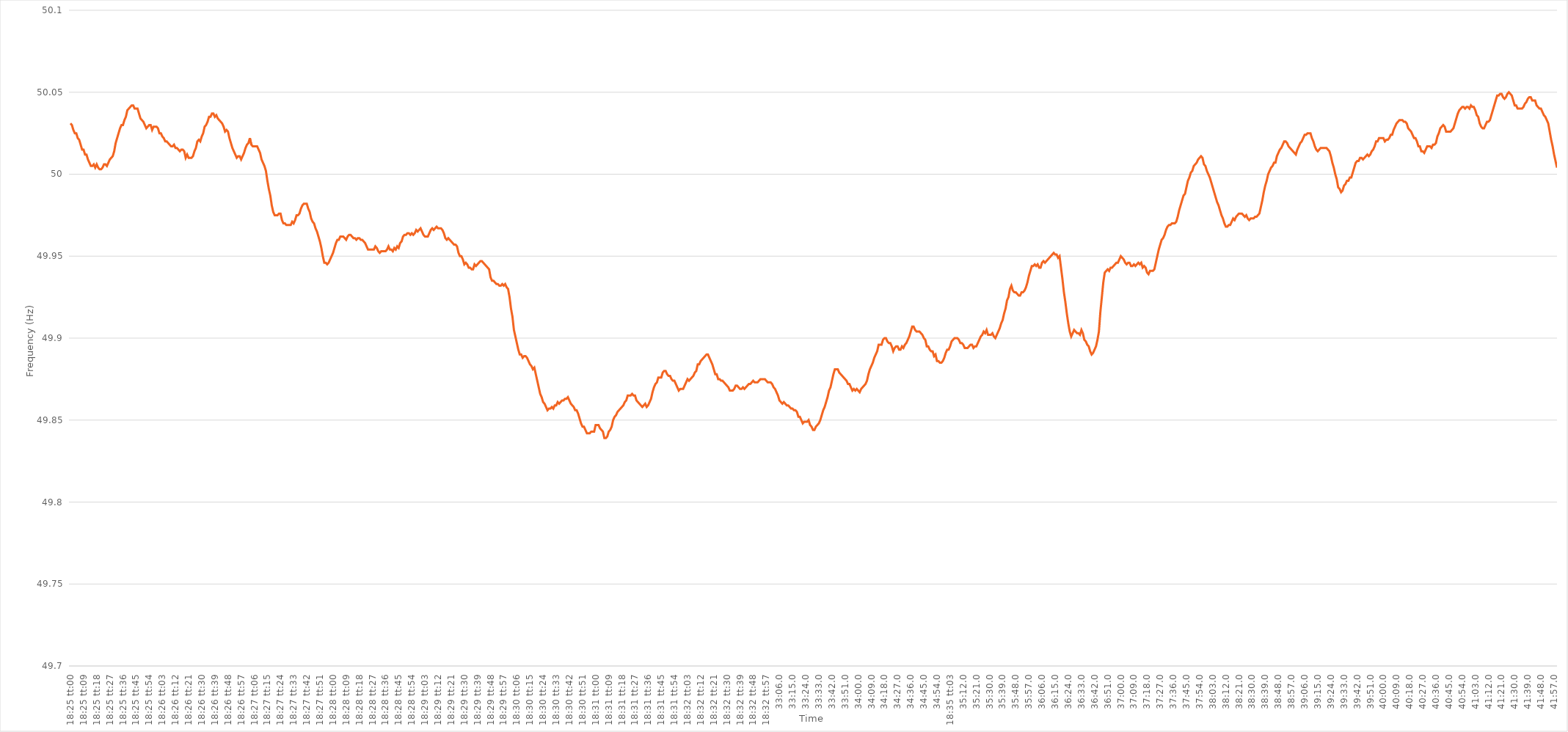
| Category | Series 0 |
|---|---|
| 0.7673611111111112 | 50.031 |
| 0.7673726851851851 | 50.03 |
| 0.7673842592592592 | 50.027 |
| 0.7673958333333334 | 50.025 |
| 0.7674074074074074 | 50.025 |
| 0.7674189814814815 | 50.022 |
| 0.7674305555555555 | 50.021 |
| 0.7674421296296297 | 50.018 |
| 0.7674537037037038 | 50.015 |
| 0.7674652777777777 | 50.015 |
| 0.7674768518518519 | 50.012 |
| 0.7674884259259259 | 50.012 |
| 0.7675000000000001 | 50.009 |
| 0.767511574074074 | 50.007 |
| 0.7675231481481481 | 50.005 |
| 0.7675347222222223 | 50.005 |
| 0.7675462962962962 | 50.006 |
| 0.7675578703703704 | 50.004 |
| 0.7675694444444444 | 50.006 |
| 0.7675810185185186 | 50.004 |
| 0.7675925925925925 | 50.003 |
| 0.7676041666666666 | 50.003 |
| 0.7676157407407408 | 50.004 |
| 0.7676273148148148 | 50.006 |
| 0.7676388888888889 | 50.006 |
| 0.7676504629629629 | 50.005 |
| 0.7676620370370371 | 50.007 |
| 0.7676736111111112 | 50.009 |
| 0.7676851851851851 | 50.01 |
| 0.7676967592592593 | 50.011 |
| 0.7677083333333333 | 50.014 |
| 0.7677199074074075 | 50.019 |
| 0.7677314814814814 | 50.022 |
| 0.7677430555555556 | 50.025 |
| 0.7677546296296297 | 50.028 |
| 0.7677662037037036 | 50.03 |
| 0.7677777777777778 | 50.03 |
| 0.7677893518518518 | 50.033 |
| 0.767800925925926 | 50.035 |
| 0.7678124999999999 | 50.039 |
| 0.767824074074074 | 50.04 |
| 0.7678356481481482 | 50.041 |
| 0.7678472222222222 | 50.042 |
| 0.7678587962962963 | 50.042 |
| 0.7678703703703703 | 50.04 |
| 0.7678819444444445 | 50.04 |
| 0.7678935185185186 | 50.04 |
| 0.7679050925925925 | 50.037 |
| 0.7679166666666667 | 50.034 |
| 0.7679282407407407 | 50.033 |
| 0.7679398148148149 | 50.032 |
| 0.7679513888888888 | 50.03 |
| 0.767962962962963 | 50.028 |
| 0.7679745370370371 | 50.029 |
| 0.767986111111111 | 50.03 |
| 0.7679976851851852 | 50.03 |
| 0.7680092592592592 | 50.027 |
| 0.7680208333333334 | 50.029 |
| 0.7680324074074073 | 50.029 |
| 0.7680439814814815 | 50.029 |
| 0.7680555555555556 | 50.028 |
| 0.7680671296296296 | 50.025 |
| 0.7680787037037037 | 50.025 |
| 0.7680902777777777 | 50.023 |
| 0.7681018518518519 | 50.022 |
| 0.768113425925926 | 50.02 |
| 0.768125 | 50.02 |
| 0.7681365740740741 | 50.019 |
| 0.7681481481481481 | 50.018 |
| 0.7681597222222223 | 50.017 |
| 0.7681712962962962 | 50.017 |
| 0.7681828703703704 | 50.018 |
| 0.7681944444444445 | 50.016 |
| 0.7682060185185186 | 50.016 |
| 0.7682175925925926 | 50.015 |
| 0.7682291666666666 | 50.014 |
| 0.7682407407407408 | 50.015 |
| 0.7682523148148147 | 50.015 |
| 0.7682638888888889 | 50.014 |
| 0.768275462962963 | 50.01 |
| 0.768287037037037 | 50.012 |
| 0.7682986111111111 | 50.01 |
| 0.7683101851851851 | 50.01 |
| 0.7683217592592593 | 50.01 |
| 0.7683333333333334 | 50.011 |
| 0.7683449074074074 | 50.014 |
| 0.7683564814814815 | 50.016 |
| 0.7683680555555555 | 50.02 |
| 0.7683796296296297 | 50.021 |
| 0.7683912037037036 | 50.02 |
| 0.7684027777777778 | 50.023 |
| 0.7684143518518519 | 50.025 |
| 0.768425925925926 | 50.029 |
| 0.7684375 | 50.03 |
| 0.768449074074074 | 50.032 |
| 0.7684606481481482 | 50.035 |
| 0.7684722222222223 | 50.035 |
| 0.7684837962962963 | 50.037 |
| 0.7684953703703704 | 50.037 |
| 0.7685069444444445 | 50.035 |
| 0.7685185185185185 | 50.036 |
| 0.7685300925925925 | 50.034 |
| 0.7685416666666667 | 50.033 |
| 0.7685532407407408 | 50.032 |
| 0.7685648148148148 | 50.031 |
| 0.7685763888888889 | 50.029 |
| 0.768587962962963 | 50.026 |
| 0.7685995370370371 | 50.027 |
| 0.768611111111111 | 50.026 |
| 0.7686226851851852 | 50.022 |
| 0.7686342592592593 | 50.019 |
| 0.7686458333333334 | 50.016 |
| 0.7686574074074074 | 50.014 |
| 0.7686689814814814 | 50.012 |
| 0.7686805555555556 | 50.01 |
| 0.7686921296296297 | 50.011 |
| 0.7687037037037037 | 50.011 |
| 0.7687152777777778 | 50.009 |
| 0.7687268518518519 | 50.011 |
| 0.7687384259259259 | 50.013 |
| 0.7687499999999999 | 50.016 |
| 0.7687615740740741 | 50.018 |
| 0.7687731481481482 | 50.019 |
| 0.7687847222222222 | 50.022 |
| 0.7687962962962963 | 50.018 |
| 0.7688078703703703 | 50.017 |
| 0.7688194444444445 | 50.017 |
| 0.7688310185185184 | 50.017 |
| 0.7688425925925926 | 50.017 |
| 0.7688541666666667 | 50.015 |
| 0.7688657407407408 | 50.013 |
| 0.7688773148148148 | 50.009 |
| 0.7688888888888888 | 50.007 |
| 0.768900462962963 | 50.005 |
| 0.7689120370370371 | 50.002 |
| 0.7689236111111111 | 49.996 |
| 0.7689351851851852 | 49.991 |
| 0.7689467592592593 | 49.987 |
| 0.7689583333333333 | 49.981 |
| 0.7689699074074073 | 49.977 |
| 0.7689814814814815 | 49.975 |
| 0.7689930555555556 | 49.975 |
| 0.7690046296296296 | 49.975 |
| 0.7690162037037037 | 49.976 |
| 0.7690277777777778 | 49.976 |
| 0.7690393518518519 | 49.972 |
| 0.7690509259259258 | 49.97 |
| 0.7690625 | 49.97 |
| 0.7690740740740741 | 49.969 |
| 0.7690856481481482 | 49.969 |
| 0.7690972222222222 | 49.969 |
| 0.7691087962962962 | 49.969 |
| 0.7691203703703704 | 49.971 |
| 0.7691319444444445 | 49.97 |
| 0.7691435185185185 | 49.972 |
| 0.7691550925925926 | 49.975 |
| 0.7691666666666667 | 49.975 |
| 0.7691782407407407 | 49.976 |
| 0.7691898148148147 | 49.979 |
| 0.7692013888888889 | 49.981 |
| 0.769212962962963 | 49.982 |
| 0.769224537037037 | 49.982 |
| 0.7692361111111111 | 49.982 |
| 0.7692476851851852 | 49.979 |
| 0.7692592592592593 | 49.977 |
| 0.7692708333333332 | 49.973 |
| 0.7692824074074074 | 49.971 |
| 0.7692939814814815 | 49.97 |
| 0.7693055555555556 | 49.967 |
| 0.7693171296296296 | 49.965 |
| 0.7693287037037037 | 49.962 |
| 0.7693402777777778 | 49.959 |
| 0.769351851851852 | 49.955 |
| 0.7693634259259259 | 49.95 |
| 0.769375 | 49.946 |
| 0.7693865740740741 | 49.946 |
| 0.7693981481481482 | 49.945 |
| 0.7694097222222221 | 49.946 |
| 0.7694212962962963 | 49.948 |
| 0.7694328703703704 | 49.95 |
| 0.7694444444444444 | 49.952 |
| 0.7694560185185185 | 49.955 |
| 0.7694675925925926 | 49.958 |
| 0.7694791666666667 | 49.96 |
| 0.7694907407407406 | 49.96 |
| 0.7695023148148148 | 49.962 |
| 0.7695138888888889 | 49.962 |
| 0.769525462962963 | 49.962 |
| 0.769537037037037 | 49.961 |
| 0.7695486111111111 | 49.96 |
| 0.7695601851851852 | 49.962 |
| 0.7695717592592594 | 49.963 |
| 0.7695833333333333 | 49.963 |
| 0.7695949074074074 | 49.962 |
| 0.7696064814814815 | 49.961 |
| 0.7696180555555556 | 49.961 |
| 0.7696296296296296 | 49.96 |
| 0.7696412037037037 | 49.961 |
| 0.7696527777777779 | 49.961 |
| 0.7696643518518518 | 49.96 |
| 0.7696759259259259 | 49.96 |
| 0.7696875 | 49.959 |
| 0.7696990740740741 | 49.958 |
| 0.769710648148148 | 49.956 |
| 0.7697222222222222 | 49.954 |
| 0.7697337962962963 | 49.954 |
| 0.7697453703703704 | 49.954 |
| 0.7697569444444444 | 49.954 |
| 0.7697685185185185 | 49.954 |
| 0.7697800925925926 | 49.956 |
| 0.7697916666666668 | 49.955 |
| 0.7698032407407407 | 49.953 |
| 0.7698148148148148 | 49.952 |
| 0.7698263888888889 | 49.953 |
| 0.769837962962963 | 49.953 |
| 0.769849537037037 | 49.953 |
| 0.7698611111111111 | 49.953 |
| 0.7698726851851853 | 49.954 |
| 0.7698842592592593 | 49.956 |
| 0.7698958333333333 | 49.954 |
| 0.7699074074074074 | 49.954 |
| 0.7699189814814815 | 49.953 |
| 0.7699305555555555 | 49.955 |
| 0.7699421296296296 | 49.954 |
| 0.7699537037037038 | 49.956 |
| 0.7699652777777778 | 49.955 |
| 0.7699768518518518 | 49.958 |
| 0.7699884259259259 | 49.959 |
| 0.77 | 49.962 |
| 0.7700115740740742 | 49.963 |
| 0.7700231481481481 | 49.963 |
| 0.7700347222222222 | 49.964 |
| 0.7700462962962963 | 49.964 |
| 0.7700578703703704 | 49.963 |
| 0.7700694444444444 | 49.964 |
| 0.7700810185185185 | 49.963 |
| 0.7700925925925927 | 49.964 |
| 0.7701041666666667 | 49.966 |
| 0.7701157407407407 | 49.965 |
| 0.7701273148148148 | 49.966 |
| 0.7701388888888889 | 49.967 |
| 0.7701504629629629 | 49.965 |
| 0.770162037037037 | 49.963 |
| 0.7701736111111112 | 49.962 |
| 0.7701851851851852 | 49.962 |
| 0.7701967592592592 | 49.962 |
| 0.7702083333333333 | 49.964 |
| 0.7702199074074074 | 49.966 |
| 0.7702314814814816 | 49.967 |
| 0.7702430555555555 | 49.966 |
| 0.7702546296296297 | 49.967 |
| 0.7702662037037037 | 49.968 |
| 0.7702777777777778 | 49.967 |
| 0.7702893518518518 | 49.967 |
| 0.7703009259259259 | 49.967 |
| 0.7703125000000001 | 49.966 |
| 0.7703240740740741 | 49.964 |
| 0.7703356481481481 | 49.961 |
| 0.7703472222222222 | 49.96 |
| 0.7703587962962963 | 49.961 |
| 0.7703703703703703 | 49.96 |
| 0.7703819444444444 | 49.959 |
| 0.7703935185185186 | 49.958 |
| 0.7704050925925926 | 49.957 |
| 0.7704166666666666 | 49.957 |
| 0.7704282407407407 | 49.956 |
| 0.7704398148148148 | 49.952 |
| 0.770451388888889 | 49.95 |
| 0.7704629629629629 | 49.95 |
| 0.770474537037037 | 49.948 |
| 0.7704861111111111 | 49.945 |
| 0.7704976851851852 | 49.946 |
| 0.7705092592592592 | 49.945 |
| 0.7705208333333333 | 49.943 |
| 0.7705324074074075 | 49.943 |
| 0.7705439814814815 | 49.942 |
| 0.7705555555555555 | 49.942 |
| 0.7705671296296296 | 49.945 |
| 0.7705787037037037 | 49.944 |
| 0.7705902777777777 | 49.945 |
| 0.7706018518518518 | 49.946 |
| 0.770613425925926 | 49.947 |
| 0.770625 | 49.947 |
| 0.770636574074074 | 49.946 |
| 0.7706481481481481 | 49.945 |
| 0.7706597222222222 | 49.944 |
| 0.7706712962962964 | 49.943 |
| 0.7706828703703703 | 49.942 |
| 0.7706944444444445 | 49.937 |
| 0.7707060185185185 | 49.935 |
| 0.7707175925925926 | 49.935 |
| 0.7707291666666666 | 49.934 |
| 0.7707407407407407 | 49.933 |
| 0.7707523148148149 | 49.933 |
| 0.7707638888888889 | 49.932 |
| 0.770775462962963 | 49.932 |
| 0.770787037037037 | 49.933 |
| 0.7707986111111111 | 49.932 |
| 0.7708101851851853 | 49.933 |
| 0.7708217592592592 | 49.931 |
| 0.7708333333333334 | 49.93 |
| 0.7708449074074074 | 49.925 |
| 0.7708564814814814 | 49.918 |
| 0.7708680555555555 | 49.913 |
| 0.7708796296296296 | 49.905 |
| 0.7708912037037038 | 49.901 |
| 0.7709027777777777 | 49.897 |
| 0.7709143518518519 | 49.893 |
| 0.7709259259259259 | 49.89 |
| 0.7709375 | 49.89 |
| 0.770949074074074 | 49.888 |
| 0.7709606481481481 | 49.889 |
| 0.7709722222222223 | 49.889 |
| 0.7709837962962963 | 49.888 |
| 0.7709953703703704 | 49.886 |
| 0.7710069444444444 | 49.884 |
| 0.7710185185185185 | 49.883 |
| 0.7710300925925927 | 49.881 |
| 0.7710416666666666 | 49.882 |
| 0.7710532407407408 | 49.878 |
| 0.7710648148148148 | 49.874 |
| 0.771076388888889 | 49.87 |
| 0.7710879629629629 | 49.866 |
| 0.771099537037037 | 49.864 |
| 0.7711111111111112 | 49.861 |
| 0.7711226851851851 | 49.86 |
| 0.7711342592592593 | 49.858 |
| 0.7711458333333333 | 49.856 |
| 0.7711574074074075 | 49.857 |
| 0.7711689814814814 | 49.857 |
| 0.7711805555555555 | 49.858 |
| 0.7711921296296297 | 49.857 |
| 0.7712037037037037 | 49.859 |
| 0.7712152777777778 | 49.859 |
| 0.7712268518518518 | 49.861 |
| 0.771238425925926 | 49.86 |
| 0.7712500000000001 | 49.861 |
| 0.771261574074074 | 49.862 |
| 0.7712731481481482 | 49.862 |
| 0.7712847222222222 | 49.863 |
| 0.7712962962962964 | 49.863 |
| 0.7713078703703703 | 49.864 |
| 0.7713194444444444 | 49.862 |
| 0.7713310185185186 | 49.86 |
| 0.7713425925925925 | 49.859 |
| 0.7713541666666667 | 49.858 |
| 0.7713657407407407 | 49.856 |
| 0.7713773148148149 | 49.856 |
| 0.7713888888888888 | 49.854 |
| 0.7714004629629629 | 49.851 |
| 0.7714120370370371 | 49.848 |
| 0.7714236111111111 | 49.846 |
| 0.7714351851851852 | 49.846 |
| 0.7714467592592592 | 49.844 |
| 0.7714583333333334 | 49.842 |
| 0.7714699074074075 | 49.842 |
| 0.7714814814814814 | 49.842 |
| 0.7714930555555556 | 49.843 |
| 0.7715046296296296 | 49.843 |
| 0.7715162037037038 | 49.843 |
| 0.7715277777777777 | 49.847 |
| 0.7715393518518519 | 49.847 |
| 0.771550925925926 | 49.847 |
| 0.7715624999999999 | 49.845 |
| 0.7715740740740741 | 49.844 |
| 0.7715856481481481 | 49.843 |
| 0.7715972222222223 | 49.839 |
| 0.7716087962962962 | 49.839 |
| 0.7716203703703703 | 49.84 |
| 0.7716319444444445 | 49.843 |
| 0.7716435185185185 | 49.844 |
| 0.7716550925925926 | 49.846 |
| 0.7716666666666666 | 49.85 |
| 0.7716782407407408 | 49.852 |
| 0.7716898148148149 | 49.853 |
| 0.7717013888888888 | 49.855 |
| 0.771712962962963 | 49.856 |
| 0.771724537037037 | 49.857 |
| 0.7717361111111112 | 49.858 |
| 0.7717476851851851 | 49.859 |
| 0.7717592592592593 | 49.861 |
| 0.7717708333333334 | 49.862 |
| 0.7717824074074073 | 49.865 |
| 0.7717939814814815 | 49.865 |
| 0.7718055555555555 | 49.865 |
| 0.7718171296296297 | 49.866 |
| 0.7718287037037036 | 49.865 |
| 0.7718402777777778 | 49.865 |
| 0.7718518518518519 | 49.862 |
| 0.7718634259259259 | 49.861 |
| 0.771875 | 49.86 |
| 0.771886574074074 | 49.859 |
| 0.7718981481481482 | 49.858 |
| 0.7719097222222223 | 49.859 |
| 0.7719212962962962 | 49.86 |
| 0.7719328703703704 | 49.858 |
| 0.7719444444444444 | 49.859 |
| 0.7719560185185186 | 49.861 |
| 0.7719675925925925 | 49.863 |
| 0.7719791666666667 | 49.867 |
| 0.7719907407407408 | 49.87 |
| 0.7720023148148148 | 49.872 |
| 0.7720138888888889 | 49.873 |
| 0.7720254629629629 | 49.876 |
| 0.7720370370370371 | 49.876 |
| 0.772048611111111 | 49.876 |
| 0.7720601851851852 | 49.879 |
| 0.7720717592592593 | 49.88 |
| 0.7720833333333333 | 49.88 |
| 0.7720949074074074 | 49.878 |
| 0.7721064814814814 | 49.877 |
| 0.7721180555555556 | 49.877 |
| 0.7721296296296297 | 49.875 |
| 0.7721412037037036 | 49.874 |
| 0.7721527777777778 | 49.874 |
| 0.7721643518518518 | 49.872 |
| 0.772175925925926 | 49.87 |
| 0.7721874999999999 | 49.868 |
| 0.7721990740740741 | 49.869 |
| 0.7722106481481482 | 49.869 |
| 0.7722222222222223 | 49.869 |
| 0.7722337962962963 | 49.871 |
| 0.7722453703703703 | 49.873 |
| 0.7722569444444445 | 49.875 |
| 0.7722685185185186 | 49.874 |
| 0.7722800925925926 | 49.875 |
| 0.7722916666666667 | 49.876 |
| 0.7723032407407407 | 49.877 |
| 0.7723148148148148 | 49.879 |
| 0.7723263888888888 | 49.88 |
| 0.772337962962963 | 49.884 |
| 0.7723495370370371 | 49.884 |
| 0.772361111111111 | 49.886 |
| 0.7723726851851852 | 49.887 |
| 0.7723842592592592 | 49.888 |
| 0.7723958333333334 | 49.889 |
| 0.7724074074074073 | 49.89 |
| 0.7724189814814815 | 49.89 |
| 0.7724305555555556 | 49.888 |
| 0.7724421296296297 | 49.886 |
| 0.7724537037037037 | 49.884 |
| 0.7724652777777777 | 49.881 |
| 0.7724768518518519 | 49.878 |
| 0.772488425925926 | 49.878 |
| 0.7725 | 49.875 |
| 0.7725115740740741 | 49.875 |
| 0.7725231481481482 | 49.874 |
| 0.7725347222222222 | 49.874 |
| 0.7725462962962962 | 49.873 |
| 0.7725578703703704 | 49.872 |
| 0.7725694444444445 | 49.871 |
| 0.7725810185185185 | 49.87 |
| 0.7725925925925926 | 49.868 |
| 0.7726041666666666 | 49.868 |
| 0.7726157407407408 | 49.868 |
| 0.7726273148148147 | 49.869 |
| 0.7726388888888889 | 49.871 |
| 0.772650462962963 | 49.871 |
| 0.7726620370370371 | 49.87 |
| 0.7726736111111111 | 49.869 |
| 0.7726851851851851 | 49.869 |
| 0.7726967592592593 | 49.87 |
| 0.7727083333333334 | 49.869 |
| 0.7727199074074074 | 49.87 |
| 0.7727314814814815 | 49.871 |
| 0.7727430555555556 | 49.872 |
| 0.7727546296296296 | 49.872 |
| 0.7727662037037036 | 49.873 |
| 0.7727777777777778 | 49.874 |
| 0.7727893518518519 | 49.873 |
| 0.7728009259259259 | 49.873 |
| 0.7728125 | 49.873 |
| 0.772824074074074 | 49.874 |
| 0.7728356481481482 | 49.875 |
| 0.7728472222222221 | 49.875 |
| 0.7728587962962963 | 49.875 |
| 0.7728703703703704 | 49.875 |
| 0.7728819444444445 | 49.874 |
| 0.7728935185185185 | 49.873 |
| 0.7729050925925925 | 49.873 |
| 0.7729166666666667 | 49.873 |
| 0.7729282407407408 | 49.872 |
| 0.7729398148148148 | 49.87 |
| 0.7729513888888889 | 49.869 |
| 0.772962962962963 | 49.867 |
| 0.772974537037037 | 49.865 |
| 0.772986111111111 | 49.862 |
| 0.7729976851851852 | 49.861 |
| 0.7730092592592593 | 49.86 |
| 0.7730208333333333 | 49.861 |
| 0.7730324074074074 | 49.86 |
| 0.7730439814814815 | 49.859 |
| 0.7730555555555556 | 49.859 |
| 0.7730671296296295 | 49.858 |
| 0.7730787037037037 | 49.857 |
| 0.7730902777777778 | 49.857 |
| 0.7731018518518519 | 49.856 |
| 0.7731134259259259 | 49.856 |
| 0.773125 | 49.855 |
| 0.7731365740740741 | 49.852 |
| 0.7731481481481483 | 49.852 |
| 0.7731597222222222 | 49.85 |
| 0.7731712962962963 | 49.848 |
| 0.7731828703703704 | 49.849 |
| 0.7731944444444444 | 49.849 |
| 0.7732060185185184 | 49.849 |
| 0.7732175925925926 | 49.85 |
| 0.7732291666666667 | 49.847 |
| 0.7732407407407407 | 49.846 |
| 0.7732523148148148 | 49.844 |
| 0.7732638888888889 | 49.844 |
| 0.773275462962963 | 49.846 |
| 0.7732870370370369 | 49.847 |
| 0.7732986111111111 | 49.848 |
| 0.7733101851851852 | 49.85 |
| 0.7733217592592593 | 49.853 |
| 0.7733333333333333 | 49.856 |
| 0.7733449074074074 | 49.858 |
| 0.7733564814814815 | 49.861 |
| 0.7733680555555557 | 49.864 |
| 0.7733796296296296 | 49.868 |
| 0.7733912037037037 | 49.87 |
| 0.7734027777777778 | 49.874 |
| 0.7734143518518519 | 49.878 |
| 0.7734259259259259 | 49.881 |
| 0.7734375 | 49.881 |
| 0.7734490740740741 | 49.881 |
| 0.7734606481481481 | 49.879 |
| 0.7734722222222222 | 49.878 |
| 0.7734837962962963 | 49.877 |
| 0.7734953703703704 | 49.876 |
| 0.7735069444444443 | 49.875 |
| 0.7735185185185185 | 49.874 |
| 0.7735300925925926 | 49.872 |
| 0.7735416666666667 | 49.872 |
| 0.7735532407407407 | 49.87 |
| 0.7735648148148148 | 49.868 |
| 0.7735763888888889 | 49.869 |
| 0.7735879629629631 | 49.868 |
| 0.773599537037037 | 49.869 |
| 0.7736111111111111 | 49.868 |
| 0.7736226851851852 | 49.867 |
| 0.7736342592592593 | 49.869 |
| 0.7736458333333333 | 49.87 |
| 0.7736574074074074 | 49.871 |
| 0.7736689814814816 | 49.872 |
| 0.7736805555555556 | 49.874 |
| 0.7736921296296296 | 49.878 |
| 0.7737037037037037 | 49.881 |
| 0.7737152777777778 | 49.883 |
| 0.7737268518518517 | 49.885 |
| 0.7737384259259259 | 49.888 |
| 0.77375 | 49.89 |
| 0.7737615740740741 | 49.892 |
| 0.7737731481481481 | 49.896 |
| 0.7737847222222222 | 49.896 |
| 0.7737962962962963 | 49.896 |
| 0.7738078703703705 | 49.899 |
| 0.7738194444444444 | 49.9 |
| 0.7738310185185185 | 49.9 |
| 0.7738425925925926 | 49.898 |
| 0.7738541666666667 | 49.897 |
| 0.7738657407407407 | 49.897 |
| 0.7738773148148148 | 49.895 |
| 0.773888888888889 | 49.892 |
| 0.773900462962963 | 49.894 |
| 0.773912037037037 | 49.895 |
| 0.7739236111111111 | 49.895 |
| 0.7739351851851852 | 49.893 |
| 0.7739467592592592 | 49.893 |
| 0.7739583333333333 | 49.895 |
| 0.7739699074074075 | 49.894 |
| 0.7739814814814815 | 49.896 |
| 0.7739930555555555 | 49.897 |
| 0.7740046296296296 | 49.899 |
| 0.7740162037037037 | 49.901 |
| 0.7740277777777779 | 49.904 |
| 0.7740393518518518 | 49.907 |
| 0.774050925925926 | 49.907 |
| 0.7740625 | 49.905 |
| 0.7740740740740741 | 49.904 |
| 0.7740856481481481 | 49.904 |
| 0.7740972222222222 | 49.904 |
| 0.7741087962962964 | 49.903 |
| 0.7741203703703704 | 49.902 |
| 0.7741319444444444 | 49.9 |
| 0.7741435185185185 | 49.899 |
| 0.7741550925925926 | 49.895 |
| 0.7741666666666666 | 49.895 |
| 0.7741782407407407 | 49.893 |
| 0.7741898148148149 | 49.892 |
| 0.7742013888888889 | 49.892 |
| 0.7742129629629629 | 49.889 |
| 0.774224537037037 | 49.89 |
| 0.7742361111111111 | 49.886 |
| 0.7742476851851853 | 49.886 |
| 0.7742592592592592 | 49.885 |
| 0.7742708333333334 | 49.885 |
| 0.7742824074074074 | 49.886 |
| 0.7742939814814815 | 49.888 |
| 0.7743055555555555 | 49.891 |
| 0.7743171296296296 | 49.893 |
| 0.7743287037037038 | 49.893 |
| 0.7743402777777778 | 49.895 |
| 0.7743518518518518 | 49.898 |
| 0.7743634259259259 | 49.899 |
| 0.774375 | 49.9 |
| 0.774386574074074 | 49.9 |
| 0.7743981481481481 | 49.9 |
| 0.7744097222222223 | 49.899 |
| 0.7744212962962963 | 49.897 |
| 0.7744328703703703 | 49.897 |
| 0.7744444444444444 | 49.896 |
| 0.7744560185185185 | 49.894 |
| 0.7744675925925927 | 49.894 |
| 0.7744791666666666 | 49.894 |
| 0.7744907407407408 | 49.895 |
| 0.7745023148148148 | 49.896 |
| 0.774513888888889 | 49.896 |
| 0.7745254629629629 | 49.894 |
| 0.774537037037037 | 49.895 |
| 0.7745486111111112 | 49.895 |
| 0.7745601851851852 | 49.897 |
| 0.7745717592592593 | 49.899 |
| 0.7745833333333333 | 49.901 |
| 0.7745949074074074 | 49.902 |
| 0.7746064814814814 | 49.904 |
| 0.7746180555555555 | 49.903 |
| 0.7746296296296297 | 49.905 |
| 0.7746412037037037 | 49.902 |
| 0.7746527777777777 | 49.902 |
| 0.7746643518518518 | 49.902 |
| 0.7746759259259259 | 49.903 |
| 0.7746875000000001 | 49.901 |
| 0.774699074074074 | 49.9 |
| 0.7747106481481482 | 49.902 |
| 0.7747222222222222 | 49.904 |
| 0.7747337962962964 | 49.906 |
| 0.7747453703703703 | 49.909 |
| 0.7747569444444444 | 49.911 |
| 0.7747685185185186 | 49.915 |
| 0.7747800925925926 | 49.918 |
| 0.7747916666666667 | 49.923 |
| 0.7748032407407407 | 49.925 |
| 0.7748148148148148 | 49.93 |
| 0.774826388888889 | 49.932 |
| 0.7748379629629629 | 49.929 |
| 0.7748495370370371 | 49.928 |
| 0.7748611111111111 | 49.928 |
| 0.7748726851851853 | 49.927 |
| 0.7748842592592592 | 49.926 |
| 0.7748958333333333 | 49.926 |
| 0.7749074074074075 | 49.928 |
| 0.7749189814814814 | 49.928 |
| 0.7749305555555556 | 49.929 |
| 0.7749421296296296 | 49.931 |
| 0.7749537037037038 | 49.934 |
| 0.7749652777777777 | 49.938 |
| 0.7749768518518518 | 49.941 |
| 0.774988425925926 | 49.944 |
| 0.775 | 49.944 |
| 0.7750115740740741 | 49.945 |
| 0.7750231481481481 | 49.944 |
| 0.7750347222222222 | 49.945 |
| 0.7750462962962964 | 49.943 |
| 0.7750578703703703 | 49.943 |
| 0.7750694444444445 | 49.946 |
| 0.7750810185185185 | 49.947 |
| 0.7750925925925927 | 49.946 |
| 0.7751041666666666 | 49.947 |
| 0.7751157407407407 | 49.948 |
| 0.7751273148148149 | 49.949 |
| 0.7751388888888888 | 49.95 |
| 0.775150462962963 | 49.951 |
| 0.775162037037037 | 49.952 |
| 0.7751736111111112 | 49.951 |
| 0.7751851851851851 | 49.951 |
| 0.7751967592592592 | 49.949 |
| 0.7752083333333334 | 49.95 |
| 0.7752199074074074 | 49.943 |
| 0.7752314814814815 | 49.936 |
| 0.7752430555555555 | 49.928 |
| 0.7752546296296297 | 49.922 |
| 0.7752662037037038 | 49.915 |
| 0.7752777777777777 | 49.909 |
| 0.7752893518518519 | 49.904 |
| 0.7753009259259259 | 49.901 |
| 0.7753125000000001 | 49.903 |
| 0.775324074074074 | 49.905 |
| 0.7753356481481481 | 49.904 |
| 0.7753472222222223 | 49.903 |
| 0.7753587962962962 | 49.903 |
| 0.7753703703703704 | 49.902 |
| 0.7753819444444444 | 49.905 |
| 0.7753935185185186 | 49.903 |
| 0.7754050925925925 | 49.899 |
| 0.7754166666666666 | 49.898 |
| 0.7754282407407408 | 49.896 |
| 0.7754398148148148 | 49.895 |
| 0.7754513888888889 | 49.892 |
| 0.7754629629629629 | 49.89 |
| 0.7754745370370371 | 49.891 |
| 0.7754861111111112 | 49.893 |
| 0.7754976851851851 | 49.895 |
| 0.7755092592592593 | 49.899 |
| 0.7755208333333333 | 49.904 |
| 0.7755324074074075 | 49.916 |
| 0.7755439814814814 | 49.925 |
| 0.7755555555555556 | 49.934 |
| 0.7755671296296297 | 49.94 |
| 0.7755787037037036 | 49.941 |
| 0.7755902777777778 | 49.942 |
| 0.7756018518518518 | 49.941 |
| 0.775613425925926 | 49.943 |
| 0.7756249999999999 | 49.943 |
| 0.775636574074074 | 49.944 |
| 0.7756481481481482 | 49.945 |
| 0.7756597222222222 | 49.946 |
| 0.7756712962962963 | 49.946 |
| 0.7756828703703703 | 49.948 |
| 0.7756944444444445 | 49.95 |
| 0.7757060185185186 | 49.949 |
| 0.7757175925925925 | 49.948 |
| 0.7757291666666667 | 49.946 |
| 0.7757407407407407 | 49.945 |
| 0.7757523148148149 | 49.946 |
| 0.7757638888888888 | 49.946 |
| 0.775775462962963 | 49.944 |
| 0.7757870370370371 | 49.944 |
| 0.775798611111111 | 49.945 |
| 0.7758101851851852 | 49.944 |
| 0.7758217592592592 | 49.945 |
| 0.7758333333333334 | 49.946 |
| 0.7758449074074073 | 49.945 |
| 0.7758564814814815 | 49.946 |
| 0.7758680555555556 | 49.943 |
| 0.7758796296296296 | 49.944 |
| 0.7758912037037037 | 49.943 |
| 0.7759027777777777 | 49.94 |
| 0.7759143518518519 | 49.939 |
| 0.775925925925926 | 49.941 |
| 0.7759375 | 49.941 |
| 0.7759490740740741 | 49.941 |
| 0.7759606481481481 | 49.942 |
| 0.7759722222222223 | 49.946 |
| 0.7759837962962962 | 49.95 |
| 0.7759953703703704 | 49.954 |
| 0.7760069444444445 | 49.957 |
| 0.7760185185185186 | 49.96 |
| 0.7760300925925926 | 49.961 |
| 0.7760416666666666 | 49.963 |
| 0.7760532407407408 | 49.966 |
| 0.7760648148148147 | 49.968 |
| 0.7760763888888889 | 49.969 |
| 0.776087962962963 | 49.969 |
| 0.776099537037037 | 49.97 |
| 0.7761111111111111 | 49.97 |
| 0.7761226851851851 | 49.97 |
| 0.7761342592592593 | 49.971 |
| 0.7761458333333334 | 49.974 |
| 0.7761574074074074 | 49.978 |
| 0.7761689814814815 | 49.981 |
| 0.7761805555555555 | 49.984 |
| 0.7761921296296297 | 49.987 |
| 0.7762037037037036 | 49.988 |
| 0.7762152777777778 | 49.992 |
| 0.7762268518518519 | 49.996 |
| 0.776238425925926 | 49.998 |
| 0.77625 | 50.001 |
| 0.776261574074074 | 50.002 |
| 0.7762731481481482 | 50.005 |
| 0.7762847222222223 | 50.006 |
| 0.7762962962962963 | 50.007 |
| 0.7763078703703704 | 50.009 |
| 0.7763194444444445 | 50.01 |
| 0.7763310185185185 | 50.011 |
| 0.7763425925925925 | 50.01 |
| 0.7763541666666667 | 50.006 |
| 0.7763657407407408 | 50.005 |
| 0.7763773148148148 | 50.002 |
| 0.7763888888888889 | 50 |
| 0.776400462962963 | 49.998 |
| 0.7764120370370371 | 49.995 |
| 0.776423611111111 | 49.992 |
| 0.7764351851851852 | 49.989 |
| 0.7764467592592593 | 49.986 |
| 0.7764583333333334 | 49.983 |
| 0.7764699074074074 | 49.981 |
| 0.7764814814814814 | 49.978 |
| 0.7764930555555556 | 49.975 |
| 0.7765046296296297 | 49.973 |
| 0.7765162037037037 | 49.97 |
| 0.7765277777777778 | 49.968 |
| 0.7765393518518519 | 49.968 |
| 0.7765509259259259 | 49.969 |
| 0.7765624999999999 | 49.969 |
| 0.7765740740740741 | 49.971 |
| 0.7765856481481482 | 49.973 |
| 0.7765972222222222 | 49.972 |
| 0.7766087962962963 | 49.974 |
| 0.7766203703703703 | 49.975 |
| 0.7766319444444445 | 49.976 |
| 0.7766435185185184 | 49.976 |
| 0.7766550925925926 | 49.976 |
| 0.7766666666666667 | 49.975 |
| 0.7766782407407408 | 49.974 |
| 0.7766898148148148 | 49.975 |
| 0.7767013888888888 | 49.973 |
| 0.776712962962963 | 49.972 |
| 0.7767245370370371 | 49.973 |
| 0.7767361111111111 | 49.973 |
| 0.7767476851851852 | 49.973 |
| 0.7767592592592593 | 49.974 |
| 0.7767708333333333 | 49.974 |
| 0.7767824074074073 | 49.975 |
| 0.7767939814814815 | 49.976 |
| 0.7768055555555556 | 49.98 |
| 0.7768171296296296 | 49.984 |
| 0.7768287037037037 | 49.989 |
| 0.7768402777777778 | 49.993 |
| 0.7768518518518519 | 49.996 |
| 0.7768634259259258 | 50 |
| 0.776875 | 50.002 |
| 0.7768865740740741 | 50.004 |
| 0.7768981481481482 | 50.005 |
| 0.7769097222222222 | 50.007 |
| 0.7769212962962962 | 50.007 |
| 0.7769328703703704 | 50.011 |
| 0.7769444444444445 | 50.013 |
| 0.7769560185185185 | 50.015 |
| 0.7769675925925926 | 50.016 |
| 0.7769791666666667 | 50.018 |
| 0.7769907407407407 | 50.02 |
| 0.7770023148148147 | 50.02 |
| 0.7770138888888889 | 50.019 |
| 0.777025462962963 | 50.017 |
| 0.777037037037037 | 50.016 |
| 0.7770486111111111 | 50.015 |
| 0.7770601851851852 | 50.014 |
| 0.7770717592592593 | 50.013 |
| 0.7770833333333332 | 50.012 |
| 0.7770949074074074 | 50.015 |
| 0.7771064814814815 | 50.017 |
| 0.7771180555555556 | 50.019 |
| 0.7771296296296296 | 50.02 |
| 0.7771412037037037 | 50.022 |
| 0.7771527777777778 | 50.024 |
| 0.777164351851852 | 50.024 |
| 0.7771759259259259 | 50.025 |
| 0.7771875 | 50.025 |
| 0.7771990740740741 | 50.025 |
| 0.7772106481481481 | 50.022 |
| 0.7772222222222221 | 50.02 |
| 0.7772337962962963 | 50.017 |
| 0.7772453703703704 | 50.015 |
| 0.7772569444444444 | 50.014 |
| 0.7772685185185185 | 50.015 |
| 0.7772800925925926 | 50.016 |
| 0.7772916666666667 | 50.016 |
| 0.7773032407407406 | 50.016 |
| 0.7773148148148148 | 50.016 |
| 0.7773263888888889 | 50.016 |
| 0.777337962962963 | 50.015 |
| 0.777349537037037 | 50.014 |
| 0.7773611111111111 | 50.011 |
| 0.7773726851851852 | 50.007 |
| 0.7773842592592594 | 50.004 |
| 0.7773958333333333 | 50 |
| 0.7774074074074074 | 49.997 |
| 0.7774189814814815 | 49.992 |
| 0.7774305555555556 | 49.991 |
| 0.7774421296296296 | 49.989 |
| 0.7774537037037037 | 49.99 |
| 0.7774652777777779 | 49.993 |
| 0.7774768518518519 | 49.994 |
| 0.7774884259259259 | 49.996 |
| 0.7775 | 49.996 |
| 0.7775115740740741 | 49.998 |
| 0.777523148148148 | 49.998 |
| 0.7775347222222222 | 50.001 |
| 0.7775462962962963 | 50.004 |
| 0.7775578703703704 | 50.007 |
| 0.7775694444444444 | 50.008 |
| 0.7775810185185185 | 50.008 |
| 0.7775925925925926 | 50.01 |
| 0.7776041666666668 | 50.01 |
| 0.7776157407407407 | 50.009 |
| 0.7776273148148148 | 50.01 |
| 0.7776388888888889 | 50.011 |
| 0.777650462962963 | 50.012 |
| 0.777662037037037 | 50.011 |
| 0.7776736111111111 | 50.012 |
| 0.7776851851851853 | 50.014 |
| 0.7776967592592593 | 50.015 |
| 0.7777083333333333 | 50.017 |
| 0.7777199074074074 | 50.02 |
| 0.7777314814814815 | 50.02 |
| 0.7777430555555555 | 50.022 |
| 0.7777546296296296 | 50.022 |
| 0.7777662037037038 | 50.022 |
| 0.7777777777777778 | 50.022 |
| 0.7777893518518518 | 50.02 |
| 0.7778009259259259 | 50.021 |
| 0.7778125 | 50.021 |
| 0.7778240740740742 | 50.022 |
| 0.7778356481481481 | 50.024 |
| 0.7778472222222222 | 50.024 |
| 0.7778587962962963 | 50.027 |
| 0.7778703703703704 | 50.029 |
| 0.7778819444444444 | 50.031 |
| 0.7778935185185185 | 50.032 |
| 0.7779050925925927 | 50.033 |
| 0.7779166666666667 | 50.033 |
| 0.7779282407407407 | 50.033 |
| 0.7779398148148148 | 50.032 |
| 0.7779513888888889 | 50.032 |
| 0.7779629629629629 | 50.031 |
| 0.777974537037037 | 50.028 |
| 0.7779861111111112 | 50.027 |
| 0.7779976851851852 | 50.026 |
| 0.7780092592592592 | 50.024 |
| 0.7780208333333333 | 50.022 |
| 0.7780324074074074 | 50.022 |
| 0.7780439814814816 | 50.02 |
| 0.7780555555555555 | 50.017 |
| 0.7780671296296297 | 50.017 |
| 0.7780787037037037 | 50.014 |
| 0.7780902777777778 | 50.014 |
| 0.7781018518518518 | 50.013 |
| 0.7781134259259259 | 50.015 |
| 0.7781250000000001 | 50.017 |
| 0.7781365740740741 | 50.017 |
| 0.7781481481481481 | 50.017 |
| 0.7781597222222222 | 50.016 |
| 0.7781712962962963 | 50.018 |
| 0.7781828703703703 | 50.018 |
| 0.7781944444444444 | 50.019 |
| 0.7782060185185186 | 50.023 |
| 0.7782175925925926 | 50.025 |
| 0.7782291666666666 | 50.028 |
| 0.7782407407407407 | 50.029 |
| 0.7782523148148148 | 50.03 |
| 0.778263888888889 | 50.029 |
| 0.7782754629629629 | 50.026 |
| 0.778287037037037 | 50.026 |
| 0.7782986111111111 | 50.026 |
| 0.7783101851851852 | 50.026 |
| 0.7783217592592592 | 50.027 |
| 0.7783333333333333 | 50.028 |
| 0.7783449074074075 | 50.031 |
| 0.7783564814814815 | 50.034 |
| 0.7783680555555555 | 50.037 |
| 0.7783796296296296 | 50.039 |
| 0.7783912037037037 | 50.04 |
| 0.7784027777777777 | 50.041 |
| 0.7784143518518518 | 50.041 |
| 0.778425925925926 | 50.04 |
| 0.7784375 | 50.041 |
| 0.778449074074074 | 50.041 |
| 0.7784606481481481 | 50.04 |
| 0.7784722222222222 | 50.042 |
| 0.7784837962962964 | 50.041 |
| 0.7784953703703703 | 50.041 |
| 0.7785069444444445 | 50.039 |
| 0.7785185185185185 | 50.036 |
| 0.7785300925925926 | 50.035 |
| 0.7785416666666666 | 50.031 |
| 0.7785532407407407 | 50.029 |
| 0.7785648148148149 | 50.028 |
| 0.7785763888888889 | 50.028 |
| 0.778587962962963 | 50.03 |
| 0.778599537037037 | 50.032 |
| 0.7786111111111111 | 50.032 |
| 0.7786226851851853 | 50.033 |
| 0.7786342592592592 | 50.036 |
| 0.7786458333333334 | 50.039 |
| 0.7786574074074074 | 50.042 |
| 0.7786689814814814 | 50.045 |
| 0.7786805555555555 | 50.048 |
| 0.7786921296296296 | 50.048 |
| 0.7787037037037038 | 50.049 |
| 0.7787152777777777 | 50.049 |
| 0.7787268518518519 | 50.047 |
| 0.7787384259259259 | 50.046 |
| 0.77875 | 50.047 |
| 0.778761574074074 | 50.049 |
| 0.7787731481481481 | 50.05 |
| 0.7787847222222223 | 50.049 |
| 0.7787962962962963 | 50.048 |
| 0.7788078703703704 | 50.045 |
| 0.7788194444444444 | 50.042 |
| 0.7788310185185185 | 50.042 |
| 0.7788425925925927 | 50.04 |
| 0.7788541666666666 | 50.04 |
| 0.7788657407407408 | 50.04 |
| 0.7788773148148148 | 50.04 |
| 0.778888888888889 | 50.041 |
| 0.7789004629629629 | 50.043 |
| 0.778912037037037 | 50.044 |
| 0.7789236111111112 | 50.046 |
| 0.7789351851851851 | 50.047 |
| 0.7789467592592593 | 50.047 |
| 0.7789583333333333 | 50.045 |
| 0.7789699074074075 | 50.045 |
| 0.7789814814814814 | 50.045 |
| 0.7789930555555555 | 50.042 |
| 0.7790046296296297 | 50.041 |
| 0.7790162037037037 | 50.04 |
| 0.7790277777777778 | 50.04 |
| 0.7790393518518518 | 50.038 |
| 0.779050925925926 | 50.036 |
| 0.7790625000000001 | 50.035 |
| 0.779074074074074 | 50.033 |
| 0.7790856481481482 | 50.031 |
| 0.7790972222222222 | 50.026 |
| 0.7791087962962964 | 50.021 |
| 0.7791203703703703 | 50.017 |
| 0.7791319444444444 | 50.012 |
| 0.7791435185185186 | 50.008 |
| 0.7791550925925925 | 50.004 |